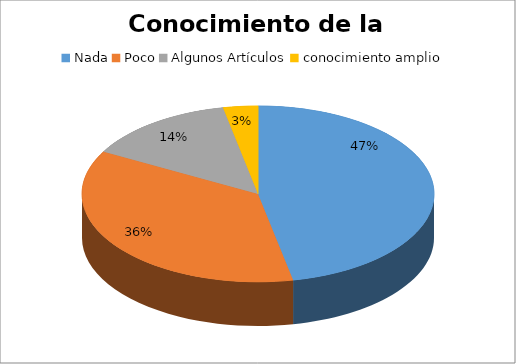
| Category | Series 0 |
|---|---|
| Nada | 44 |
| Poco | 34 |
| Algunos Artículos | 13 |
| conocimiento amplio | 3 |